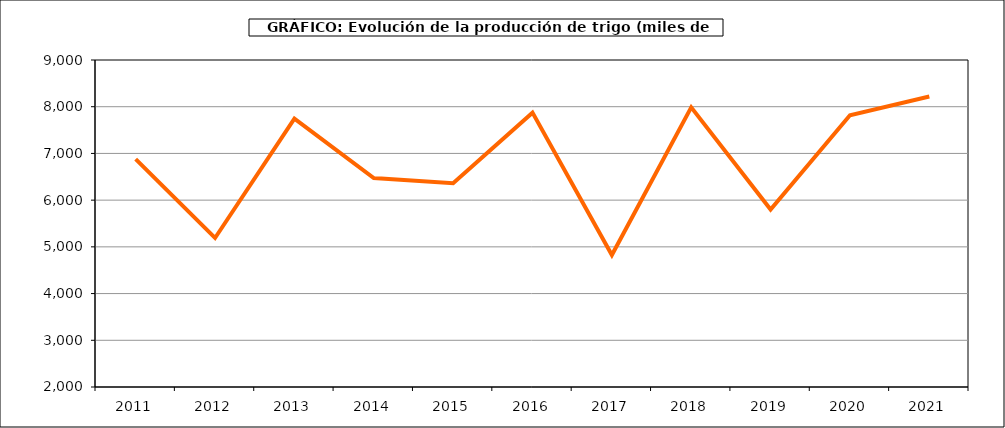
| Category | Producción |
|---|---|
| 2011.0 | 6876.651 |
| 2012.0 | 5189.828 |
| 2013.0 | 7744.928 |
| 2014.0 | 6472.734 |
| 2015.0 | 6362.692 |
| 2016.0 | 7873.135 |
| 2017.0 | 4825.109 |
| 2018.0 | 7985.7 |
| 2019.0 | 5798.695 |
| 2020.0 | 7817.06 |
| 2021.0 | 8220.148 |